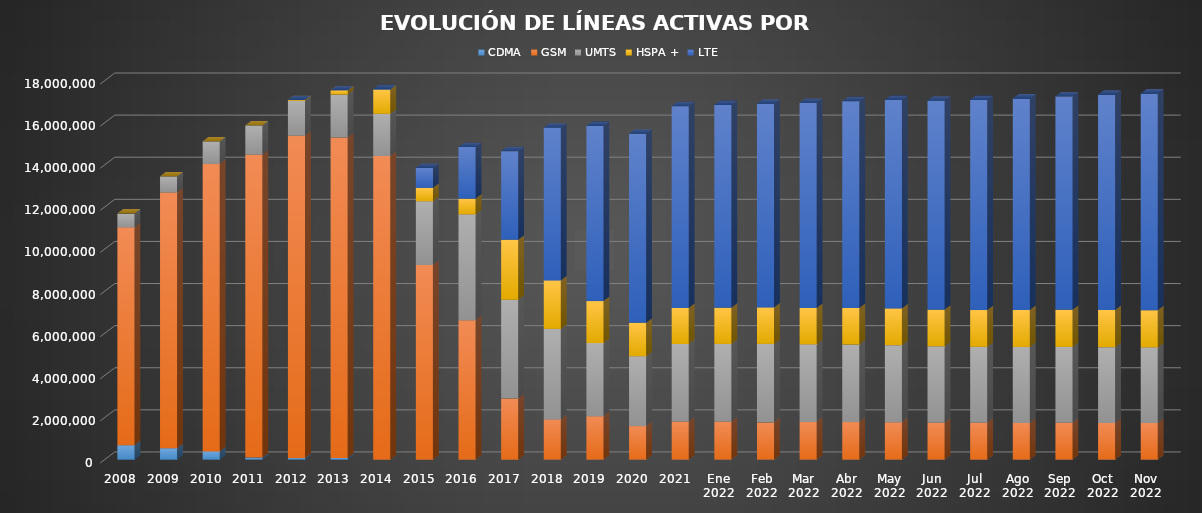
| Category | CDMA | GSM | UMTS | HSPA + | LTE |
|---|---|---|---|---|---|
| 2008 | 688357 | 10346902 | 656989 | 0 | 0 |
| 2009 | 544313 | 12151710 | 758577 | 0 | 0 |
| 2010 | 389834 | 13657394 | 1071603 | 0 | 0 |
| 2011 | 102115 | 14379423 | 1393020 | 0 | 0 |
| 2012 | 75179 | 15310006 | 1658596 | 43082 | 0 |
| 2013 | 83748 | 15215287 | 2043321 | 199398 | 0 |
| 2014 | 3009 | 14418144 | 2006405 | 1148823 | 28176 |
| 2015 | 0 | 9252920 | 3019889 | 636488 | 949723 |
| 2016 | 0 | 6621574 | 5027714 | 748032 | 2450814 |
| 2017 | 0 | 2903370.634 | 4688270.066 | 2852941.199 | 4206822.101 |
| 2018 | 0 | 1909938.891 | 4302462.415 | 2301651 | 7258785.694 |
| 2019 | 0 | 2068130.505 | 3468519.705 | 1995507 | 8320942.79 |
| 2020 | 0 | 1595680.621 | 3315009.099 | 1591073 | 8983603.28 |
| 2021 | 0 | 1804531 | 3688873 | 1717066 | 9579130 |
| Ene 2022 | 0 | 1805568.915 | 3691993.367 | 1724655 | 9625971.718 |
| Feb 2022 | 0 | 1766433.449 | 3732997.987 | 1730603 | 9675803.564 |
| Mar 2022 | 0 | 1788524.686 | 3683797.748 | 1734523 | 9742847.566 |
| Abr 2022 | 0 | 1787551.615 | 3681280.387 | 1738734 | 9820230.999 |
| May 2022 | 0 | 1778055.41 | 3660016.984 | 1744330 | 9902399.607 |
| Jun 2022 | 0 | 1757626.897 | 3624197.892 | 1745386 | 9928728.21 |
| Jul 2022 | 0 | 1753354.905 | 3606713.14 | 1747790 | 9978154.955 |
| Ago 2022 | 0 | 1747992.74 | 3606888.27 | 1755977 | 10044823.989 |
| Sep 2022 | 0 | 1748744.773 | 3608561.42 | 1762387 | 10133940.807 |
| Oct 2022 | 0 | 1746425.589 | 3596863.637 | 1766818 | 10227690.775 |
| Nov 2022 | 0 | 1743194.396 | 3586144.099 | 1770763 | 10291843.505 |